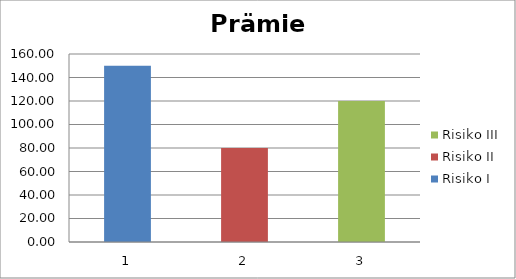
| Category | Risiko I | Risiko II | Risiko III |
|---|---|---|---|
| 0 | 150 | 0 | 0 |
| 1 | 0 | 80 | 0 |
| 2 | 0 | 0 | 120 |